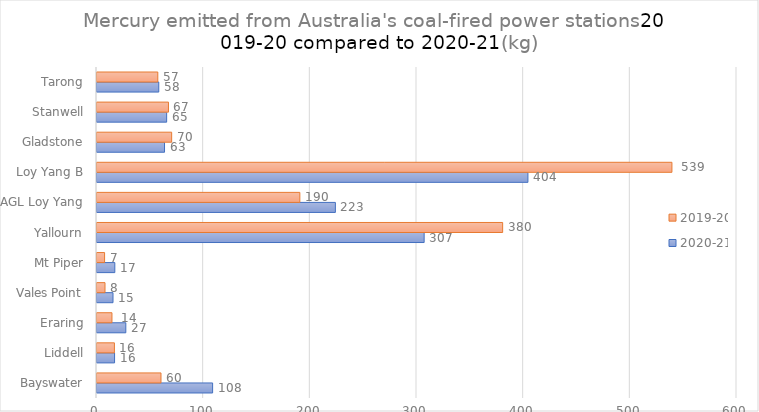
| Category | 2020-21 | 2019-20 |
|---|---|---|
| Bayswater | 108.398 | 59.998 |
| Liddell | 16.472 | 16.332 |
|  Eraring  | 27.022 | 14.02 |
| Vales Point | 15.004 | 7.506 |
| Mt Piper | 16.704 | 7.113 |
| Yallourn | 306.7 | 380.3 |
| AGL Loy Yang | 223.485 | 190.181 |
|  Loy Yang B  | 404 | 539 |
| Gladstone | 63.303 | 70 |
| Stanwell | 65.303 | 67 |
| Tarong | 57.914 | 57 |